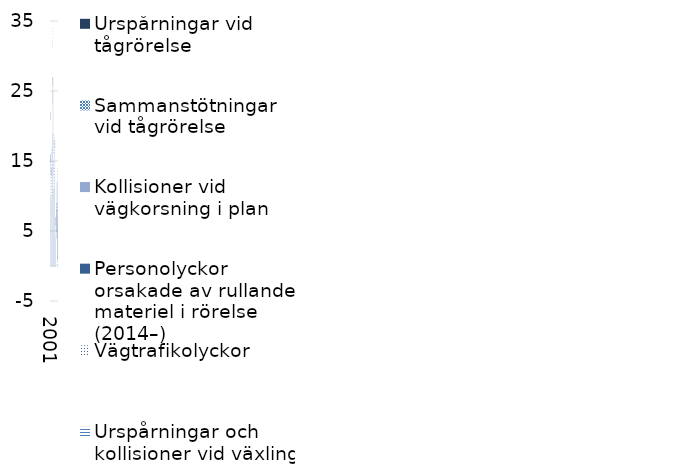
| Category | Andra olyckshändelser | Urspårningar och kollisioner vid växling  (2007–) | Vägtrafikolyckor | Personolyckor orsakade av rullande materiel i rörelse (2014–) | Kollisioner vid vägkorsning i plan | Sammanstötningar vid tågrörelse | Urspårningar vid tågrörelse  |
|---|---|---|---|---|---|---|---|
| 2001 | 16 | 0 | 5 | 0 | 0 | 0 | 1 |
| 2002 | 10 | 0 | 3 | 0 | 0 | 2 | 1 |
| 2003 | 10 | 0 | 3 | 0 | 0 | 4 | 0 |
| 2004 | 9 | 0 | 4 | 0 | 0 | 0 | 1 |
| 2005 | 19 | 0 | 4 | 0 | 3 | 0 | 1 |
| 2006 | 25 | 0 | 6 | 0 | 1 | 2 | 0 |
| 2007 | 27 | 0 | 3 | 0 | 0 | 0 | 0 |
| 2008 | 11 | 0 | 2 | 0 | 1 | 1 | 0 |
| 2009 | 13 | 0 | 3 | 0 | 0 | 3 | 0 |
| 2010 | 13 | 1 | 0 | 0 | 0 | 0 | 0 |
| 2011 | 11 | 0 | 3 | 0 | 2 | 1 | 1 |
| 2012 | 6 | 0 | 0 | 0 | 0 | 0 | 1 |
| 2013 | 4 | 0 | 0 | 0 | 0 | 0 | 0 |
| 2014 | 0 | 0 | 4 | 5 | 3 | 0 | 0 |
| 2015 | 0 | 0 | 5 | 3 | 0 | 1 | 0 |
| 2016 | 0 | 0 | 1 | 6 | 1 | 1 | 0 |
| 2017 | 0 | 0 | 1 | 11 | 1 | 1 | 0 |